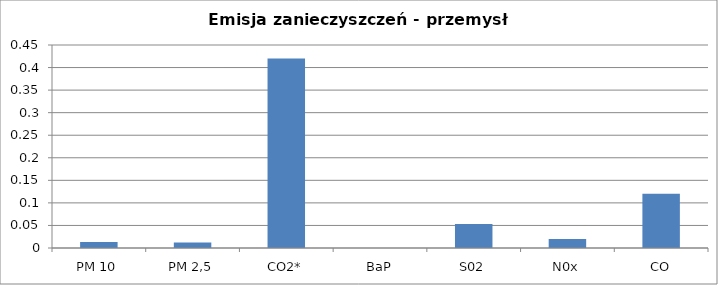
| Category | Series 0 |
|---|---|
| PM 10 | 0.013 |
| PM 2,5 | 0.012 |
| CO2* | 0.42 |
| BaP | 0 |
| S02 | 0.053 |
| N0x | 0.02 |
| CO | 0.12 |